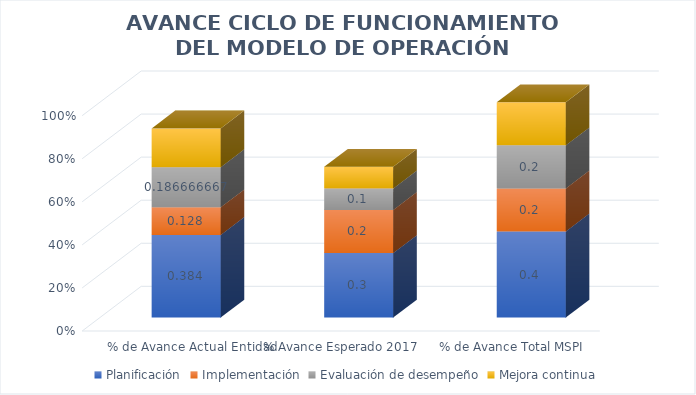
| Category | Planificación | Implementación | Evaluación de desempeño | Mejora continua |
|---|---|---|---|---|
| % de Avance Actual Entidad | 0.384 | 0.128 | 0.187 | 0.18 |
| % Avance Esperado 2017 | 0.3 | 0.2 | 0.1 | 0.1 |
| % de Avance Total MSPI | 0.4 | 0.2 | 0.2 | 0.2 |